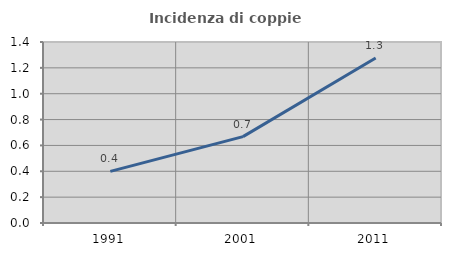
| Category | Incidenza di coppie miste |
|---|---|
| 1991.0 | 0.4 |
| 2001.0 | 0.668 |
| 2011.0 | 1.277 |